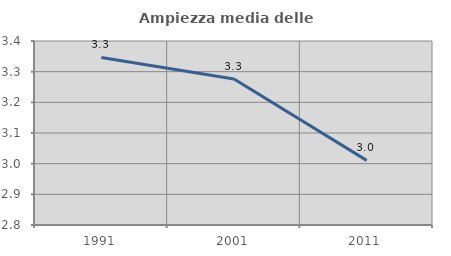
| Category | Ampiezza media delle famiglie |
|---|---|
| 1991.0 | 3.346 |
| 2001.0 | 3.276 |
| 2011.0 | 3.011 |